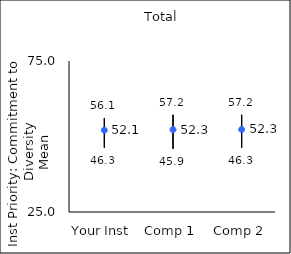
| Category | 25th percentile | 75th percentile | Mean |
|---|---|---|---|
| Your Inst | 46.3 | 56.1 | 52.07 |
| Comp 1 | 45.9 | 57.2 | 52.29 |
| Comp 2 | 46.3 | 57.2 | 52.32 |